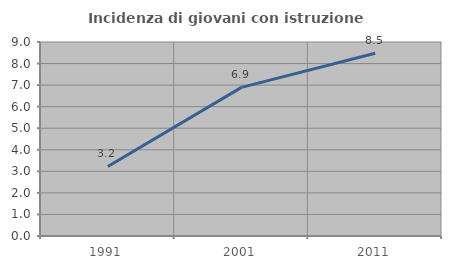
| Category | Incidenza di giovani con istruzione universitaria |
|---|---|
| 1991.0 | 3.226 |
| 2001.0 | 6.897 |
| 2011.0 | 8.475 |